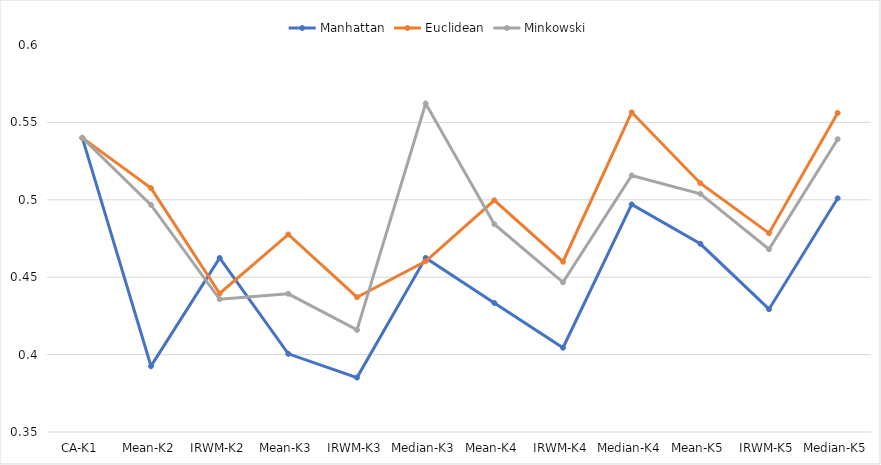
| Category | Manhattan | Euclidean | Minkowski |
|---|---|---|---|
| CA-K1 | 0.54 | 0.54 | 0.54 |
| Mean-K2 | 0.393 | 0.508 | 0.497 |
| IRWM-K2 | 0.462 | 0.439 | 0.436 |
| Mean-K3 | 0.4 | 0.478 | 0.439 |
| IRWM-K3 | 0.385 | 0.437 | 0.416 |
| Median-K3 | 0.462 | 0.46 | 0.562 |
| Mean-K4 | 0.433 | 0.5 | 0.484 |
| IRWM-K4 | 0.404 | 0.46 | 0.447 |
| Median-K4 | 0.497 | 0.557 | 0.516 |
| Mean-K5 | 0.472 | 0.511 | 0.504 |
| IRWM-K5 | 0.429 | 0.478 | 0.468 |
| Median-K5 | 0.501 | 0.556 | 0.539 |